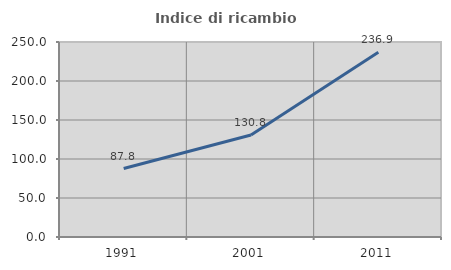
| Category | Indice di ricambio occupazionale  |
|---|---|
| 1991.0 | 87.767 |
| 2001.0 | 130.812 |
| 2011.0 | 236.859 |